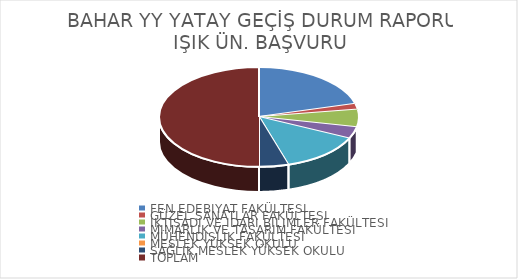
| Category | BAHAR YY YATAY GEÇİŞ DURUM RAPORU IŞIK ÜN. BAŞVURU | BAHAR YY YATAY GEÇİŞ DURUM RAPORU KURUM DIŞI BAŞVURU | BAHAR YY YATAY GEÇİŞ DURUM RAPORU TOPLAM BAŞVURU |
|---|---|---|---|
| FEN EDEBİYAT FAKÜLTESİ | 22 | 5 | 27 |
| GÜZEL SANATLAR FAKÜLTESİ | 2 | 2 | 4 |
| İKTİSADİ VE İDARİ BİLİMLER FAKÜLTESİ | 6 | 3 | 9 |
| MİMARLIK VE TASARIM FAKÜLTESİ | 4 | 3 | 7 |
| MÜHENDİSLİK FAKÜLTESİ | 14 | 7 | 21 |
| MESLEK YÜKSEK OKULU | 0 | 2 | 2 |
| SAĞLIK MESLEK YÜKSEK OKULU | 5 | 4 | 9 |
| TOPLAM | 53 | 26 | 79 |